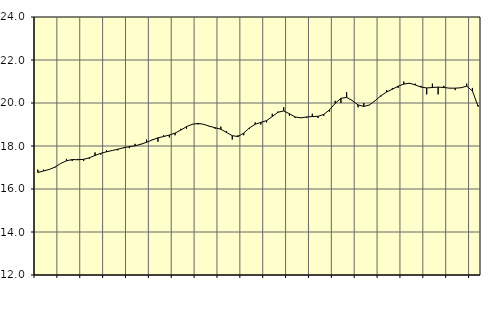
| Category | Piggar | Vård och omsorg, SNI 86-88 |
|---|---|---|
| nan | 16.9 | 16.77 |
| 1.0 | 16.9 | 16.84 |
| 1.0 | 16.9 | 16.91 |
| 1.0 | 17 | 17.02 |
| nan | 17.2 | 17.19 |
| 2.0 | 17.4 | 17.31 |
| 2.0 | 17.3 | 17.37 |
| 2.0 | 17.4 | 17.36 |
| nan | 17.3 | 17.38 |
| 3.0 | 17.4 | 17.45 |
| 3.0 | 17.7 | 17.56 |
| 3.0 | 17.6 | 17.66 |
| nan | 17.8 | 17.73 |
| 4.0 | 17.8 | 17.79 |
| 4.0 | 17.8 | 17.85 |
| 4.0 | 17.9 | 17.92 |
| nan | 17.9 | 17.97 |
| 5.0 | 18.1 | 18.01 |
| 5.0 | 18.1 | 18.08 |
| 5.0 | 18.3 | 18.17 |
| nan | 18.3 | 18.28 |
| 6.0 | 18.2 | 18.38 |
| 6.0 | 18.5 | 18.44 |
| 6.0 | 18.4 | 18.51 |
| nan | 18.5 | 18.6 |
| 7.0 | 18.8 | 18.74 |
| 7.0 | 18.8 | 18.9 |
| 7.0 | 19 | 19.01 |
| nan | 19 | 19.05 |
| 8.0 | 19 | 19.01 |
| 8.0 | 18.9 | 18.92 |
| 8.0 | 18.8 | 18.85 |
| nan | 18.9 | 18.78 |
| 9.0 | 18.7 | 18.63 |
| 9.0 | 18.3 | 18.48 |
| 9.0 | 18.5 | 18.44 |
| nan | 18.5 | 18.6 |
| 10.0 | 18.8 | 18.84 |
| 10.0 | 19.1 | 19.01 |
| 10.0 | 19 | 19.1 |
| nan | 19.1 | 19.18 |
| 11.0 | 19.5 | 19.37 |
| 11.0 | 19.6 | 19.57 |
| 11.0 | 19.8 | 19.63 |
| nan | 19.4 | 19.5 |
| 12.0 | 19.3 | 19.35 |
| 12.0 | 19.3 | 19.31 |
| 12.0 | 19.3 | 19.35 |
| nan | 19.5 | 19.37 |
| 13.0 | 19.3 | 19.38 |
| 13.0 | 19.4 | 19.47 |
| 13.0 | 19.6 | 19.68 |
| nan | 20.1 | 19.98 |
| 14.0 | 20 | 20.22 |
| 14.0 | 20.5 | 20.26 |
| 14.0 | 20.1 | 20.11 |
| nan | 19.8 | 19.91 |
| 15.0 | 20 | 19.84 |
| 15.0 | 19.9 | 19.91 |
| 15.0 | 20.1 | 20.11 |
| nan | 20.3 | 20.34 |
| 16.0 | 20.6 | 20.51 |
| 16.0 | 20.7 | 20.64 |
| 16.0 | 20.7 | 20.78 |
| nan | 21 | 20.88 |
| 17.0 | 20.9 | 20.92 |
| 17.0 | 20.9 | 20.84 |
| 17.0 | 20.8 | 20.74 |
| nan | 20.4 | 20.7 |
| 18.0 | 20.9 | 20.72 |
| 18.0 | 20.4 | 20.74 |
| 18.0 | 20.8 | 20.72 |
| nan | 20.7 | 20.69 |
| 19.0 | 20.6 | 20.69 |
| 19.0 | 20.7 | 20.71 |
| 19.0 | 20.9 | 20.78 |
| nan | 20.7 | 20.56 |
| 20.0 | 19.9 | 19.84 |